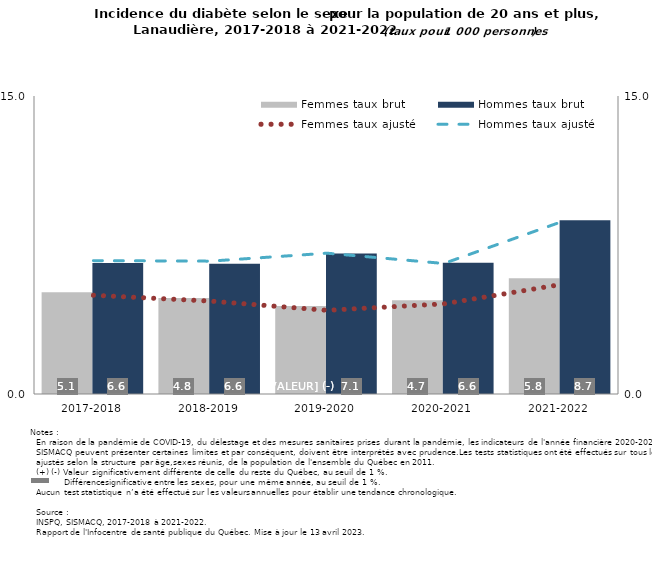
| Category | Femmes taux brut | Hommes taux brut |
|---|---|---|
| 2017-2018 | 5.118 | 6.599 |
| 2018-2019 | 4.832 | 6.562 |
| 2019-2020 | 4.423 | 7.069 |
| 2020-2021 | 4.721 | 6.602 |
| 2021-2022 | 5.828 | 8.741 |